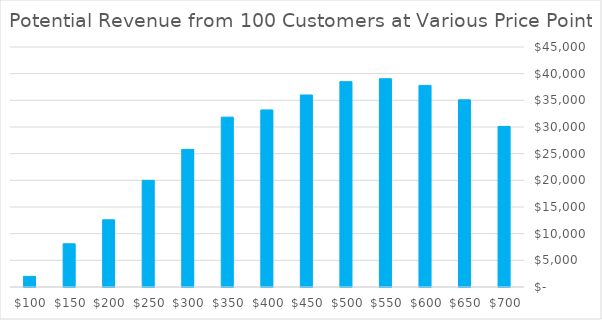
| Category | Potential Revenue |
|---|---|
| 700.0 | 30100 |
| 650.0 | 35100 |
| 600.0 | 37800 |
| 550.0 | 39050 |
| 500.0 | 38500 |
| 450.0 | 36000 |
| 400.0 | 33200 |
| 350.0 | 31850 |
| 300.0 | 25800 |
| 250.0 | 20000 |
| 200.0 | 12600 |
| 150.0 | 8100 |
| 100.0 | 2000 |